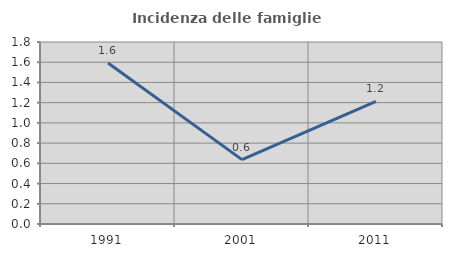
| Category | Incidenza delle famiglie numerose |
|---|---|
| 1991.0 | 1.593 |
| 2001.0 | 0.637 |
| 2011.0 | 1.213 |